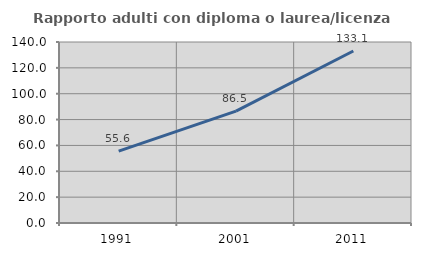
| Category | Rapporto adulti con diploma o laurea/licenza media  |
|---|---|
| 1991.0 | 55.576 |
| 2001.0 | 86.518 |
| 2011.0 | 133.057 |